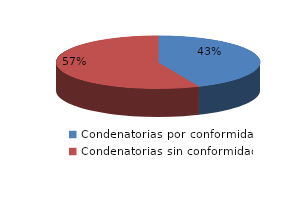
| Category | Series 0 |
|---|---|
| 0 | 10 |
| 1 | 13 |